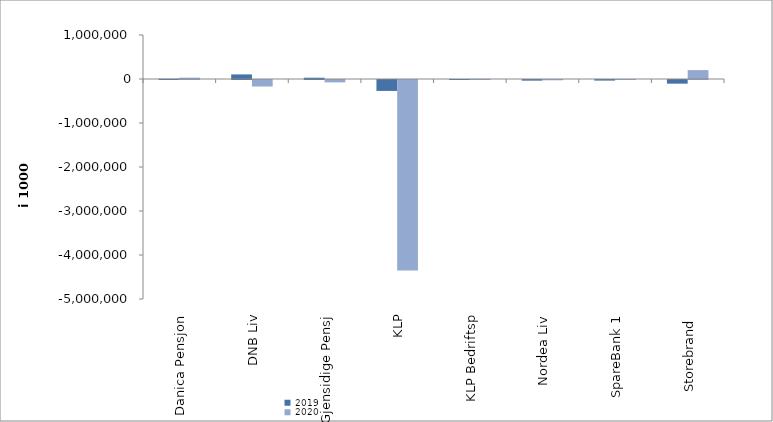
| Category | 2019 | 2020 |
|---|---|---|
| Danica Pensjon | 6109.953 | 30468.184 |
| DNB Liv | 104640 | -148121 |
| Gjensidige Pensj | 29298.6 | -54118.6 |
| KLP | -248064.624 | -4327427.537 |
| KLP Bedriftsp | 878 | 3361 |
| Nordea Liv | -14915.334 | -6168.538 |
| SpareBank 1 | -13521.345 | 23.559 |
| Storebrand  | -83232.048 | 202498.867 |